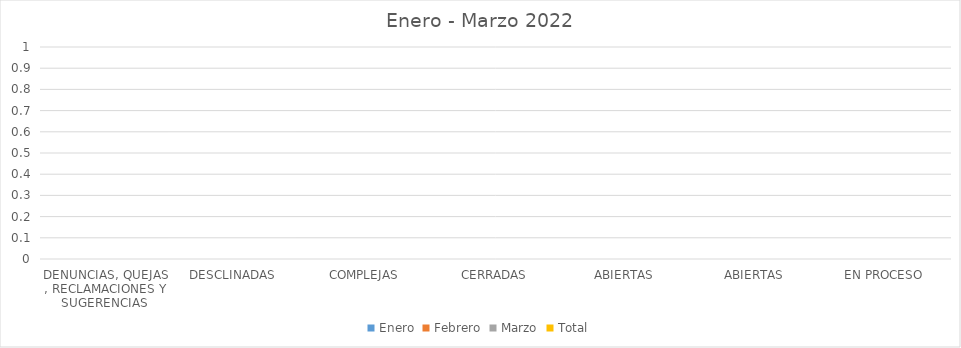
| Category | Enero | Febrero | Marzo | Total |
|---|---|---|---|---|
| DENUNCIAS, QUEJAS , RECLAMACIONES Y SUGERENCIAS  | 0 | 0 | 0 | 0 |
| DESCLINADAS  | 0 | 0 | 0 | 0 |
| COMPLEJAS | 0 | 0 | 0 | 0 |
| CERRADAS | 0 | 0 | 0 | 0 |
| ABIERTAS | 0 | 0 | 0 | 0 |
| ABIERTAS | 0 | 0 | 0 | 0 |
| EN PROCESO | 0 | 0 | 0 | 0 |